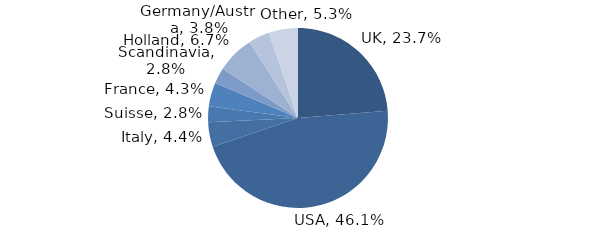
| Category | Investment Style |
|---|---|
| UK | 0.237 |
| USA | 0.461 |
| Italy | 0.044 |
| Suisse | 0.028 |
| France | 0.043 |
| Scandinavia | 0.028 |
| Holland | 0.067 |
| Germany/Austria | 0.038 |
| Other | 0.053 |